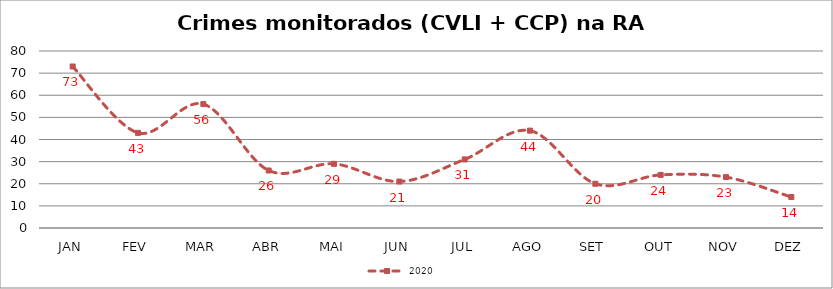
| Category | 2020 |
|---|---|
| JAN | 73 |
| FEV | 43 |
| MAR | 56 |
| ABR | 26 |
| MAI | 29 |
| JUN | 21 |
| JUL | 31 |
| AGO | 44 |
| SET | 20 |
| OUT | 24 |
| NOV | 23 |
| DEZ | 14 |